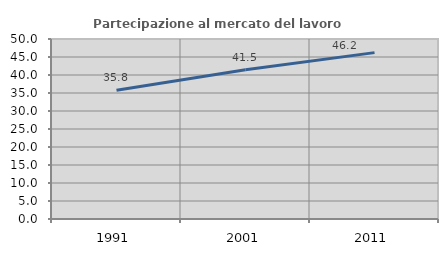
| Category | Partecipazione al mercato del lavoro  femminile |
|---|---|
| 1991.0 | 35.771 |
| 2001.0 | 41.451 |
| 2011.0 | 46.215 |